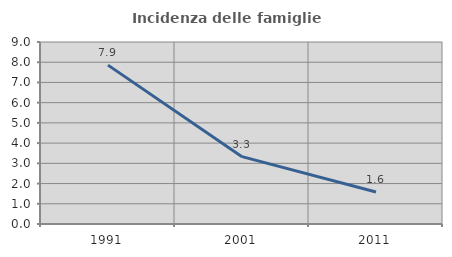
| Category | Incidenza delle famiglie numerose |
|---|---|
| 1991.0 | 7.856 |
| 2001.0 | 3.33 |
| 2011.0 | 1.584 |